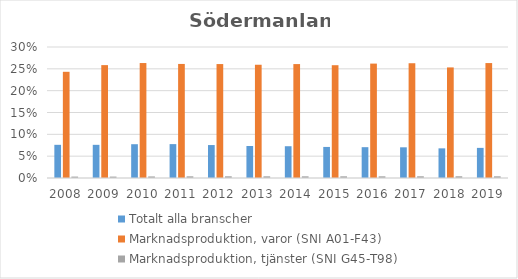
| Category | Totalt alla branscher | Marknadsproduktion, varor (SNI A01-F43) | Marknadsproduktion, tjänster (SNI G45-T98) |
|---|---|---|---|
| 2008.0 | 0.076 | 0.243 | 0.003 |
| 2009.0 | 0.076 | 0.259 | 0.003 |
| 2010.0 | 0.077 | 0.263 | 0.004 |
| 2011.0 | 0.078 | 0.261 | 0.004 |
| 2012.0 | 0.075 | 0.261 | 0.004 |
| 2013.0 | 0.073 | 0.259 | 0.004 |
| 2014.0 | 0.073 | 0.261 | 0.004 |
| 2015.0 | 0.071 | 0.258 | 0.004 |
| 2016.0 | 0.071 | 0.262 | 0.004 |
| 2017.0 | 0.07 | 0.263 | 0.004 |
| 2018.0 | 0.068 | 0.253 | 0.004 |
| 2019.0 | 0.069 | 0.263 | 0.004 |